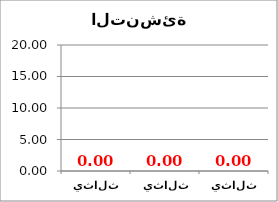
| Category | Series 0 |
|---|---|
| ثلاثي 1 | 0 |
| ثلاثي 2 | 0 |
| ثلاثي 3 | 0 |